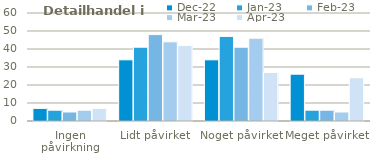
| Category | dec-22 | jan-23 | feb-23 | mar-23 | apr-23 |
|---|---|---|---|---|---|
| Ingen påvirkning | 7 | 6 | 5 | 6 | 7 |
| Lidt påvirket | 34 | 41 | 48 | 44 | 42 |
| Noget påvirket | 34 | 47 | 41 | 46 | 27 |
| Meget påvirket | 26 | 6 | 6 | 5 | 24 |